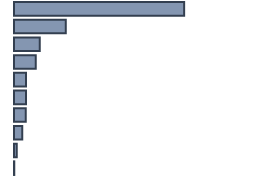
| Category | Percentatge |
|---|---|
| 0 | 70.895 |
| 1 | 21.574 |
| 2 | 10.702 |
| 3 | 9.06 |
| 4 | 5.04 |
| 5 | 4.983 |
| 6 | 4.87 |
| 7 | 3.398 |
| 8 | 1.189 |
| 9 | 0.113 |